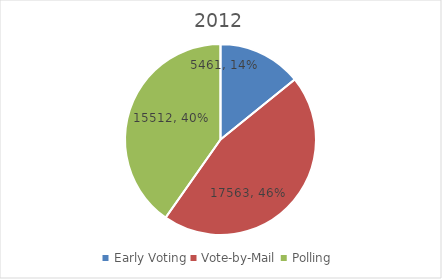
| Category | Series 0 |
|---|---|
| Early Voting | 5461 |
| Vote-by-Mail | 17563 |
| Polling | 15512 |